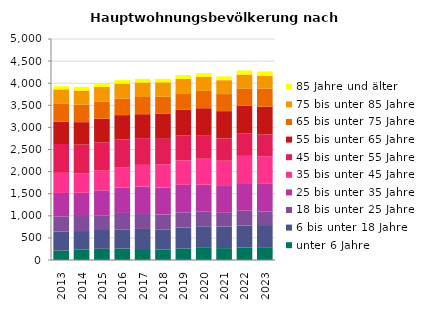
| Category | unter 6 Jahre | 6 bis unter 18 Jahre | 18 bis unter 25 Jahre | 25 bis unter 35 Jahre | 35 bis unter 45 Jahre | 45 bis unter 55 Jahre | 55 bis unter 65 Jahre | 65 bis unter 75 Jahre | 75 bis unter 85 Jahre | 85 Jahre und älter |
|---|---|---|---|---|---|---|---|---|---|---|
| 2013.0 | 215 | 428 | 344 | 530 | 455 | 653 | 503 | 416 | 317 | 71 |
| 2014.0 | 233 | 422 | 341 | 524 | 440 | 650 | 509 | 395 | 320 | 83 |
| 2015.0 | 254 | 425 | 332 | 566 | 443 | 644 | 533 | 389 | 329 | 86 |
| 2016.0 | 260 | 425 | 380 | 575 | 461 | 629 | 548 | 371 | 341 | 80 |
| 2017.0 | 248 | 455 | 359 | 599 | 491 | 605 | 542 | 389 | 329 | 80 |
| 2018.0 | 239 | 446 | 344 | 611 | 524 | 578 | 572 | 380 | 326 | 77 |
| 2019.0 | 263 | 470 | 344 | 623 | 554 | 560 | 587 | 371 | 326 | 86 |
| 2020.0 | 275 | 488 | 338 | 602 | 587 | 536 | 608 | 392 | 317 | 86 |
| 2021.0 | 269 | 488 | 311 | 605 | 572 | 506 | 617 | 386 | 314 | 86 |
| 2022.0 | 284 | 494 | 338 | 623 | 617 | 512 | 626 | 389 | 314 | 92 |
| 2023.0 | 275 | 494 | 326 | 641 | 611 | 494 | 629 | 407 | 293 | 98 |